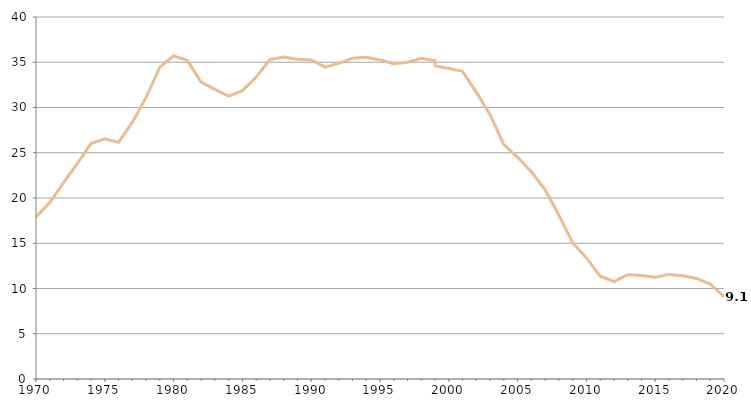
| Category | Series 0 |
|---|---|
| 1970.0 | 17.9 |
| 1971.0 | 19.5 |
| 1972.0 | 21.7 |
| 1973.0 | 23.8 |
| 1974.0 | 26.02 |
| 1975.0 | 26.55 |
| 1976.0 | 26.15 |
| 1977.0 | 28.35 |
| 1978.0 | 31.12 |
| 1979.0 | 34.45 |
| 1980.0 | 35.7 |
| 1981.0 | 35.2 |
| 1982.0 | 32.8 |
| 1983.0 | 32 |
| 1984.0 | 31.261 |
| 1985.0 | 31.865 |
| 1986.0 | 33.344 |
| 1987.0 | 35.303 |
| 1988.0 | 35.581 |
| 1989.0 | 35.34 |
| 1990.0 | 35.247 |
| 1991.0 | 34.453 |
| 1992.0 | 34.875 |
| 1993.0 | 35.446 |
| 1994.0 | 35.544 |
| 1995.0 | 35.258 |
| 1996.0 | 34.829 |
| 1997.0 | 34.99 |
| 1998.0 | 35.437 |
| 1999.0 | 35.169 |
| 1999.0 | 34.6 |
| 2000.0 | 34.3 |
| 2001.0 | 34 |
| 2002.0 | 31.7 |
| 2003.0 | 29.2 |
| 2004.0 | 25.9 |
| 2005.0 | 24.5 |
| 2006.0 | 22.9 |
| 2007.0 | 20.9 |
| 2008.0 | 18.1 |
| 2009.0 | 15.06 |
| 2010.0 | 13.378 |
| 2011.0 | 11.354 |
| 2012.0 | 10.773 |
| 2013.0 | 11.519 |
| 2014.0 | 11.441 |
| 2015.0 | 11.244 |
| 2016.0 | 11.559 |
| 2017.0 | 11.397 |
| 2018.0 | 11.109 |
| 2019.0 | 10.481 |
| 2020.0 | 9.09 |